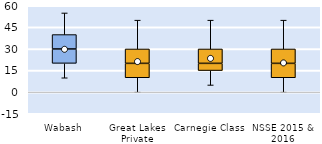
| Category | 25th | 50th | 75th |
|---|---|---|---|
| Wabash | 20 | 10 | 10 |
| Great Lakes Private | 10 | 10 | 10 |
| Carnegie Class | 15 | 5 | 10 |
| NSSE 2015 & 2016 | 10 | 10 | 10 |